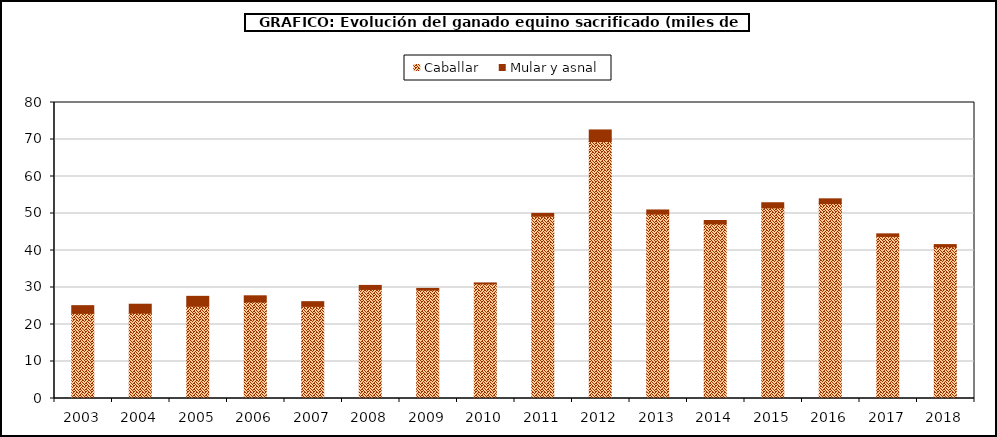
| Category | Caballar | Mular y asnal |
|---|---|---|
| 2003.0 | 23.011 | 2.082 |
| 2004.0 | 23.066 | 2.415 |
| 2005.0 | 24.929 | 2.681 |
| 2006.0 | 26.083 | 1.673 |
| 2007.0 | 24.904 | 1.267 |
| 2008.0 | 29.488 | 1.075 |
| 2009.0 | 29.317 | 0.44 |
| 2010.0 | 30.985 | 0.252 |
| 2011.0 | 49.28 | 0.744 |
| 2012.0 | 69.446 | 3.136 |
| 2013.0 | 49.841 | 1.113 |
| 2014.0 | 47.193 | 0.922 |
| 2015.0 | 51.517 | 1.391 |
| 2016.0 | 52.671 | 1.297 |
| 2017.0 | 43.813 | 0.688 |
| 2018.0 | 40.986 | 0.611 |